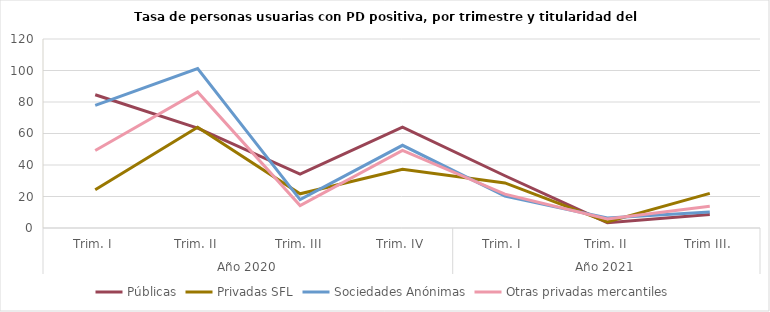
| Category | Públicas | Privadas SFL | Sociedades Anónimas | Otras privadas mercantiles |
|---|---|---|---|---|
| 0 | 84.595 | 24.261 | 77.816 | 49.233 |
| 1 | 63.423 | 63.963 | 101.199 | 86.41 |
| 2 | 34.273 | 21.727 | 17.973 | 14.279 |
| 3 | 64.059 | 37.244 | 52.501 | 49.323 |
| 4 | 33.175 | 28.599 | 20.253 | 21.492 |
| 5 | 3.371 | 3.872 | 6.343 | 5.698 |
| 6 | 8.599 | 21.954 | 10.087 | 13.861 |